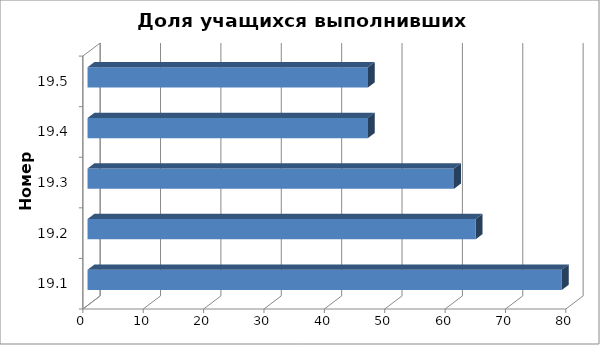
| Category | Доля учащихся выполнивших критерий |
|---|---|
| 19.1 | 78.571 |
| 19.2 | 64.286 |
| 19.3 | 60.714 |
| 19.4 | 46.429 |
| 19.5 | 46.429 |